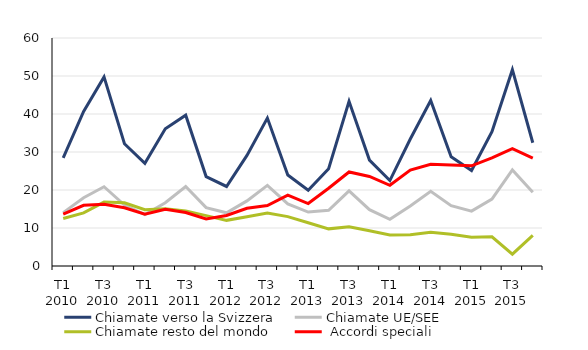
| Category | Chiamate verso la Svizzera | Chiamate UE/SEE | Chiamate resto del mondo  |  Accordi speciali  |
|---|---|---|---|---|
| T1 2010 | 28.477 | 14.043 | 12.489 | 13.652 |
| T2 2010 | 40.682 | 17.976 | 13.986 | 15.97 |
| T3 2010 | 49.76 | 20.857 | 16.822 | 16.244 |
| T4 2010 | 32.182 | 16.05 | 16.647 | 15.322 |
| T1 2011 | 27.028 | 13.521 | 14.802 | 13.655 |
| T2 2011 | 36.123 | 16.639 | 15.063 | 14.947 |
| T3 2011 | 39.695 | 20.905 | 14.504 | 14.061 |
| T4 2011 | 23.538 | 15.355 | 13.262 | 12.398 |
| T1 2012 | 20.928 | 14.002 | 12.014 | 13.307 |
| T2 2012 | 29.105 | 17.135 | 12.979 | 15.196 |
| T3 2012 | 38.934 | 21.224 | 13.948 | 15.909 |
| T4 2012 | 23.94 | 16.329 | 13.001 | 18.661 |
| T1 2013 | 19.918 | 14.191 | 11.39 | 16.433 |
| T2 2013 | 25.585 | 14.657 | 9.773 | 20.455 |
| T3 2013 | 43.334 | 19.779 | 10.348 | 24.744 |
| T4 2013 | 27.865 | 14.812 | 9.282 | 23.559 |
| T1 2014 | 22.49 | 12.275 | 8.142 | 21.246 |
| T2 2014 | 33.407 | 15.78 | 8.206 | 25.237 |
| T3 2014 | 43.568 | 19.644 | 8.861 | 26.774 |
| T4 2014 | 28.737 | 15.874 | 8.377 | 26.556 |
| T1 2015 | 25.115 | 14.452 | 7.557 | 26.365 |
| T2 2015 | 35.362 | 17.622 | 7.694 | 28.469 |
| T3 2015 | 51.661 | 25.26 | 3.124 | 30.91 |
| T4 2015 | 32.442 | 19.399 | 8.036 | 28.397 |